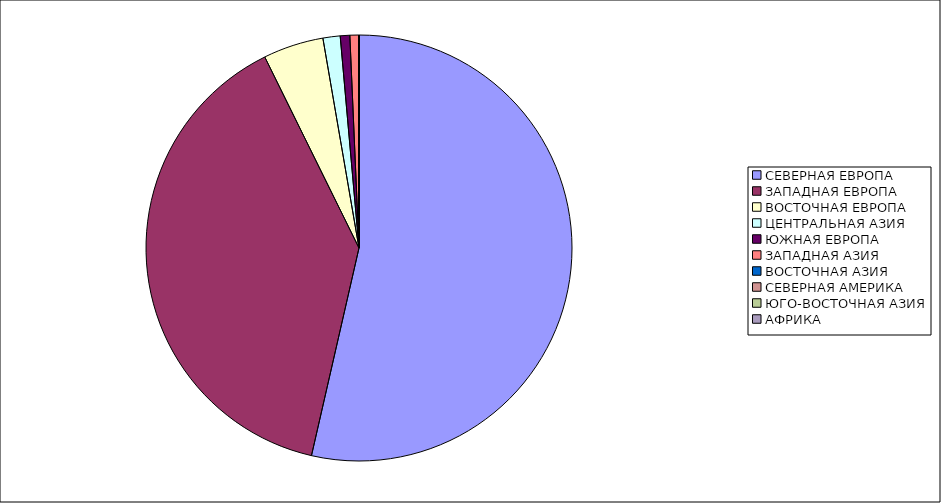
| Category | Оборот |
|---|---|
| СЕВЕРНАЯ ЕВРОПА | 53.582 |
| ЗАПАДНАЯ ЕВРОПА | 39.123 |
| ВОСТОЧНАЯ ЕВРОПА | 4.581 |
| ЦЕНТРАЛЬНАЯ АЗИЯ | 1.305 |
| ЮЖНАЯ ЕВРОПА | 0.724 |
| ЗАПАДНАЯ АЗИЯ | 0.684 |
| ВОСТОЧНАЯ АЗИЯ | 0.001 |
| СЕВЕРНАЯ АМЕРИКА | 0 |
| ЮГО-ВОСТОЧНАЯ АЗИЯ | 0 |
| АФРИКА | 0 |